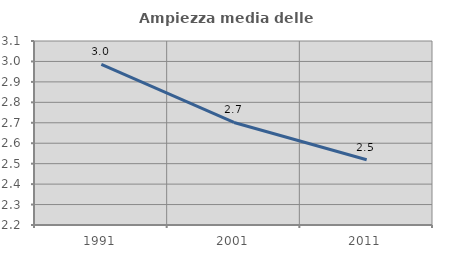
| Category | Ampiezza media delle famiglie |
|---|---|
| 1991.0 | 2.986 |
| 2001.0 | 2.701 |
| 2011.0 | 2.519 |